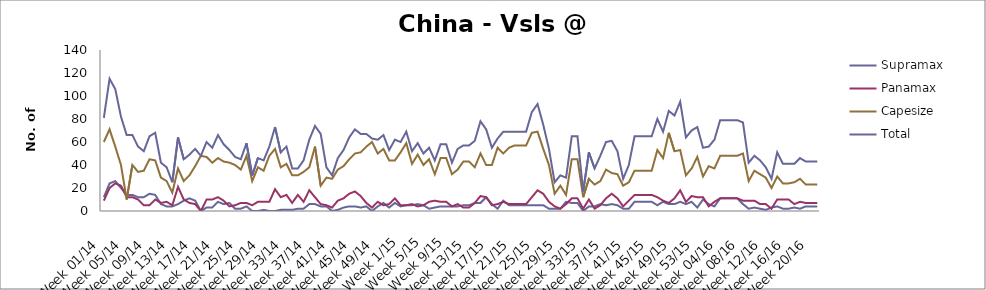
| Category | Supramax | Panamax | Capesize | Total |
|---|---|---|---|---|
| Week 01/14 | 12 | 9 | 60 | 81 |
| Week 02/14 | 24 | 20 | 71 | 115 |
| Week 03/14 | 26 | 24 | 56 | 106 |
| Week 04/14 | 20 | 22 | 40 | 82 |
| Week 05/14 | 14 | 12 | 10 | 66 |
| Week 06/14 | 14 | 12 | 40 | 66 |
| Week 07/14 | 12 | 10 | 34 | 56 |
| Week 08/14 | 12 | 5 | 35 | 52 |
| Week 09/14 | 15 | 5 | 45 | 65 |
| Week 10/14 | 14 | 10 | 44 | 68 |
| Week 11/14 | 6 | 7 | 29 | 42 |
| Week 12/14 | 4 | 8 | 26 | 38 |
| Week 13/14 | 4 | 5 | 16 | 25 |
| Week 14/14 | 6 | 21 | 37 | 64 |
| Week 15/14 | 9 | 10 | 26 | 45 |
| Week 16/14 | 11 | 7 | 31 | 49 |
| Week 17/14 | 9 | 6 | 39 | 54 |
| Week 18/14 | 0 | 0 | 48 | 48 |
| Week 19/14 | 3 | 10 | 47 | 60 |
| Week 20/14 | 3 | 10 | 42 | 55 |
| Week 21/14 | 8 | 12 | 46 | 66 |
| Week 22/14 | 6 | 9 | 43 | 58 |
| Week 23/14 | 7 | 4 | 42 | 53 |
| Week 24/14 | 2 | 5 | 40 | 47 |
| Week 25/14 | 2 | 7 | 36 | 45 |
| Week 26/14 | 4 | 7 | 48 | 59 |
| Week 27/14 | 0 | 5 | 26 | 31 |
| Week 28/14 | 0 | 8 | 38 | 46 |
| Week 29/14 | 1 | 8 | 35 | 44 |
| Week 30/14 | 0 | 8 | 48 | 56 |
| Week 31/14 | 0 | 19 | 54 | 73 |
| Week 32/14 | 1 | 12 | 38 | 51 |
| Week 33/14 | 1 | 14 | 41 | 56 |
| Week 34/14 | 1 | 7 | 31 | 37 |
| Week 35/14 | 2 | 14 | 31 | 37 |
| Week 36/14 | 2 | 8 | 34 | 44 |
| Week 37/14 | 6 | 18 | 38 | 62 |
| Week 38/14 | 6 | 12 | 56 | 74 |
| Week 39/14 | 4 | 6 | 22 | 67 |
| Week 40/14 | 4 | 5 | 29 | 38 |
| Week 41/14 | 0 | 3 | 28 | 31 |
| Week 42/14 | 1 | 9 | 36 | 46 |
| Week 43/14 | 3 | 11 | 39 | 53 |
| Week 44/14 | 4 | 15 | 45 | 64 |
| Week 45/14 | 4 | 17 | 50 | 71 |
| Week 46/14 | 3 | 13 | 51 | 67 |
| Week 47/14 | 4 | 7 | 56 | 67 |
| Week 48/14 | 0 | 3 | 60 | 63 |
| Week 49/14 | 4 | 8 | 50 | 62 |
| Week 50/14 | 7 | 5 | 54 | 66 |
| Week 51/14 | 3 | 6 | 44 | 53 |
| Week 52/14 | 7 | 11 | 44 | 62 |
| Week 1/15 | 4 | 5 | 51 | 60 |
| Week 2/15 | 5 | 5 | 59 | 69 |
| Week 3/15 | 5 | 6 | 41 | 52 |
| Week 4/15 | 6 | 4 | 49 | 59 |
| Week 5/15 | 5 | 5 | 40 | 50 |
| Week 6/15 | 2 | 8 | 45 | 55 |
| Week 7/15 | 3 | 9 | 32 | 44 |
| Week 8/15 | 4 | 8 | 46 | 58 |
| Week 9/15 | 4 | 8 | 46 | 58 |
| Week 10/15 | 4 | 4 | 32 | 42 |
| Week 11/15 | 4 | 6 | 36 | 54 |
| Week 12/15 | 5 | 3 | 43 | 57 |
| Week 13/15 | 5 | 3 | 43 | 57 |
| Week 14/15 | 7 | 7 | 38 | 61 |
| Week 15/15 | 7 | 13 | 50 | 78 |
| Week 16/15 | 12 | 12 | 40 | 71 |
| Week 17/15 | 6 | 5 | 40 | 55 |
| Week 18/15 | 2 | 6 | 55 | 63 |
| Week 19/15 | 9 | 8 | 50 | 69 |
| Week 20/15 | 5 | 6 | 55 | 69 |
| Week 21/15 | 5 | 6 | 57 | 69 |
| Week 22/15 | 5 | 6 | 57 | 69 |
| Week 23/15 | 5 | 6 | 57 | 69 |
| Week 24/15 | 5 | 12 | 68 | 86 |
| Week 25/15 | 5 | 18 | 69 | 93 |
| Week 26/15 | 5 | 15 | 54 | 75 |
| Week 27/15 | 2 | 8 | 40 | 54 |
| Week 28/15 | 2 | 4 | 15 | 25 |
| Week 29/15 | 2 | 2 | 22 | 31 |
| Week 30/15 | 8 | 6 | 14 | 29 |
| Week 31/15 | 7 | 11 | 45 | 65 |
| Week 32/15 | 7 | 11 | 45 | 65 |
| Week 33/15 | 0 | 2 | 12 | 17 |
| Week 34/15 | 4 | 10 | 28 | 51 |
| Week 35/15 | 4 | 2 | 23 | 37 |
| Week 36/15 | 6 | 5 | 26 | 48 |
| Week 37/15 | 5 | 11 | 36 | 60 |
| Week 38/15 | 6 | 15 | 33 | 61 |
| Week 39/15 | 5 | 11 | 32 | 52 |
| Week 40/15 | 2 | 4 | 22 | 28 |
| Week 41/15 | 2 | 9 | 25 | 40 |
| Week 42/15 | 8 | 14 | 35 | 65 |
| Week 43/15 | 8 | 14 | 35 | 65 |
| Week 44/15 | 8 | 14 | 35 | 65 |
| Week 45/15 | 8 | 14 | 35 | 65 |
| Week 46/15 | 5 | 12 | 53 | 80 |
| Week 47/15 | 8 | 9 | 46 | 69 |
| Week 48/15 | 6 | 7 | 68 | 87 |
| Week 49/15 | 6 | 11 | 52 | 83 |
| Week 50/15 | 8 | 18 | 53 | 95 |
| Week 51/15 | 6 | 8 | 31 | 64 |
| Week 52/15 | 8 | 13 | 37 | 70 |
| Week 53/15 | 3 | 12 | 47 | 73 |
| Week 01/16 | 10 | 12 | 30 | 55 |
| Week 02/16 | 6 | 4 | 39 | 56 |
| Week 03/16 | 4 | 8 | 37 | 62 |
| Week 04/16 | 11 | 11 | 48 | 79 |
| Week 05/16 | 11 | 11 | 48 | 79 |
| Week 06/16 | 11 | 11 | 48 | 79 |
| Week 07/16 | 11 | 11 | 48 | 79 |
| Week 08/16 | 6 | 9 | 50 | 77 |
| Week 09/16 | 2 | 9 | 26 | 42 |
| Week 10/16 | 3 | 9 | 35 | 48 |
| Week 11/16 | 2 | 6 | 32 | 44 |
| Week 12/16 | 1 | 6 | 29 | 38 |
| Week 13/16 | 3 | 2 | 20 | 28 |
| Week 14/16 | 4 | 10 | 30 | 51 |
| Week 15/16 | 2 | 10 | 24 | 41 |
| Week 16/16 | 2 | 10 | 24 | 41 |
| Week 17/16 | 3 | 6 | 25 | 41 |
| Week 18/16 | 2 | 8 | 28 | 46 |
| Week 19/16 | 4 | 7 | 23 | 43 |
| Week 20/16 | 4 | 7 | 23 | 43 |
| Week 21/16 | 4 | 7 | 23 | 43 |